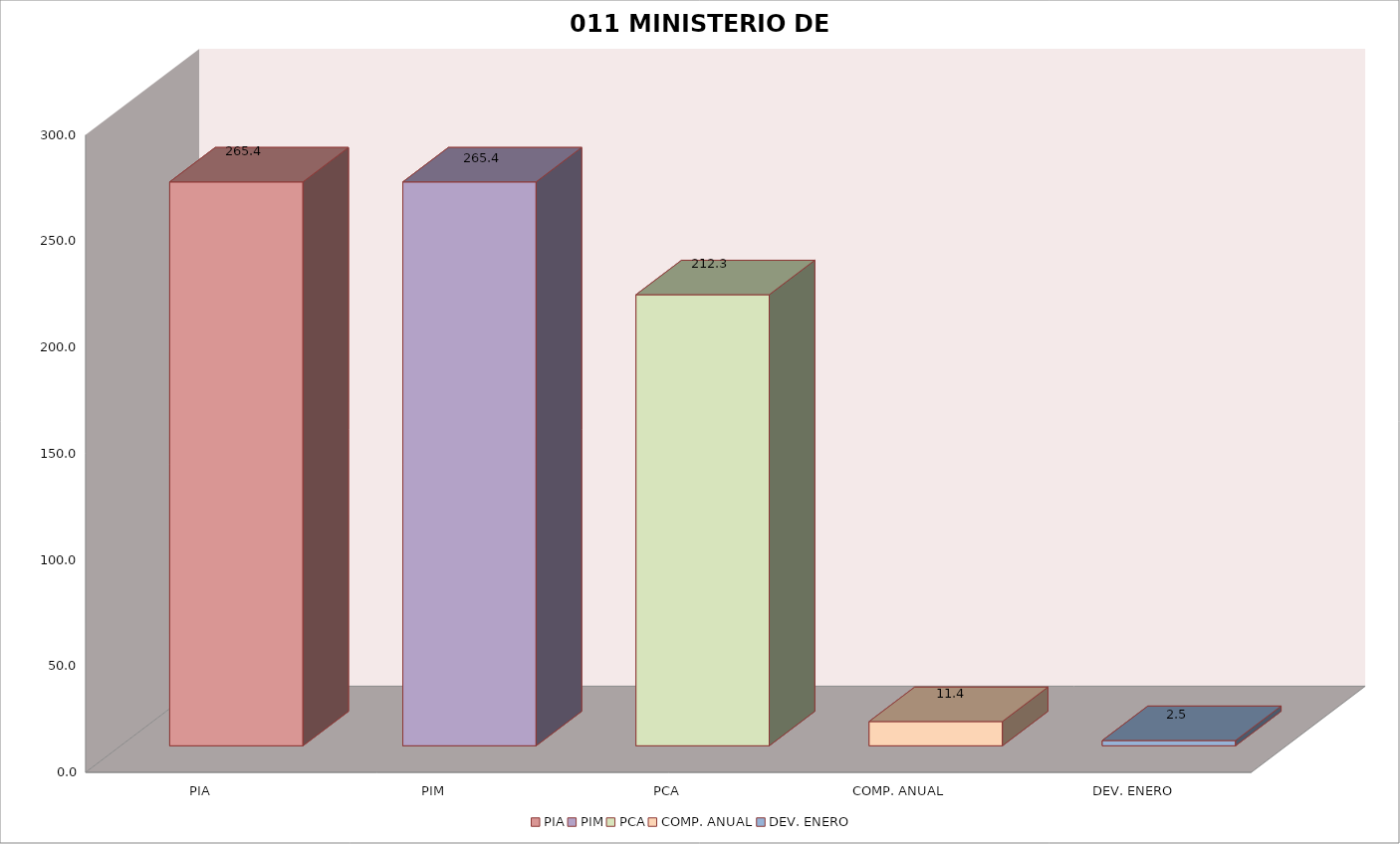
| Category | 011 MINISTERIO DE SALUD |
|---|---|
| PIA | 265.378 |
| PIM | 265.378 |
| PCA | 212.303 |
| COMP. ANUAL | 11.416 |
| DEV. ENERO | 2.476 |